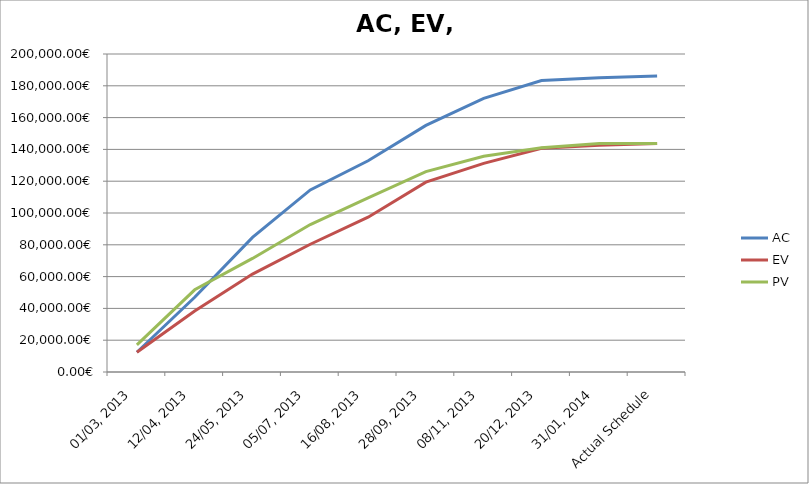
| Category | AC | EV | PV |
|---|---|---|---|
| 01/03, 2013 | 12408.4 | 12408.4 | 17112.8 |
| 12/04, 2013 | 46979.2 | 38302.7 | 51694.8 |
| 24/05, 2013 | 84670.001 | 61599.551 | 71426.8 |
| 05/07, 2013 | 114490.001 | 80354.134 | 92730.4 |
| 16/08, 2013 | 132865.601 | 97350.094 | 109501.2 |
| 28/09, 2013 | 155086.601 | 119422.4 | 126012 |
| 08/11, 2013 | 172121.8 | 131247.76 | 135674 |
| 20/12, 2013 | 183338.6 | 140709.6 | 141042 |
| 31/01, 2014 | 184995 | 142561.2 | 143673.2 |
| Actual Schedule | 186107 | 143673.2 | 143673.2 |